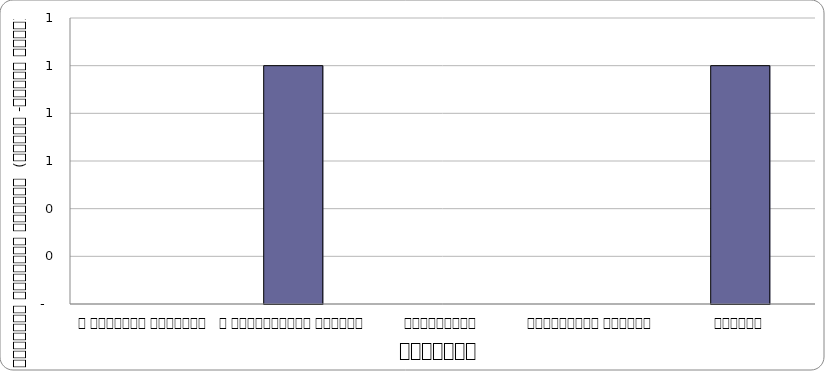
| Category | आन्दोलन |
|---|---|
| द हिमालयन टाइम्स् | 0 |
| द काठमाण्डौं पोस्ट् | 1 |
| कान्तिपुर | 0 |
| अन्नपूर्ण पोस्ट् | 0 |
| नागरिक | 1 |